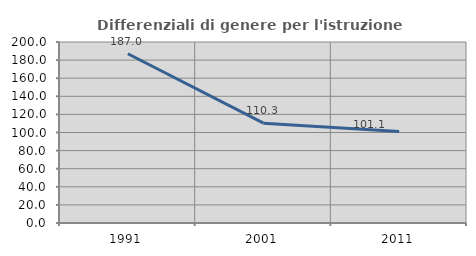
| Category | Differenziali di genere per l'istruzione superiore |
|---|---|
| 1991.0 | 186.983 |
| 2001.0 | 110.269 |
| 2011.0 | 101.131 |